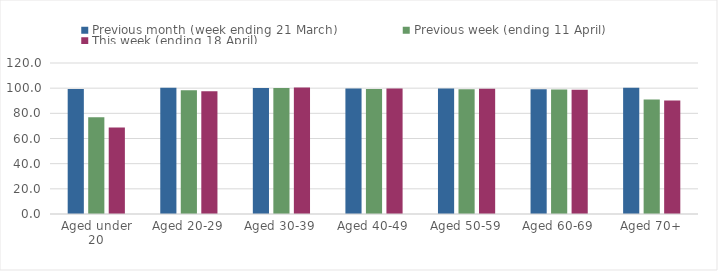
| Category | Previous month (week ending 21 March) | Previous week (ending 11 April) | This week (ending 18 April) |
|---|---|---|---|
| Aged under 20 | 99.304 | 76.871 | 68.705 |
| Aged 20-29 | 100.326 | 98.249 | 97.528 |
| Aged 30-39 | 100.083 | 100.112 | 100.547 |
| Aged 40-49 | 99.823 | 99.376 | 99.721 |
| Aged 50-59 | 99.832 | 99.145 | 99.501 |
| Aged 60-69 | 99.23 | 98.879 | 98.702 |
| Aged 70+ | 100.399 | 90.978 | 90.17 |